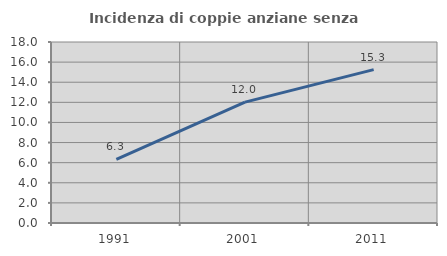
| Category | Incidenza di coppie anziane senza figli  |
|---|---|
| 1991.0 | 6.322 |
| 2001.0 | 12.02 |
| 2011.0 | 15.25 |